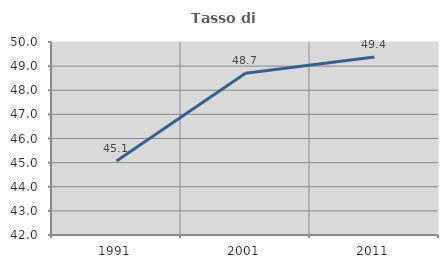
| Category | Tasso di occupazione   |
|---|---|
| 1991.0 | 45.072 |
| 2001.0 | 48.702 |
| 2011.0 | 49.374 |